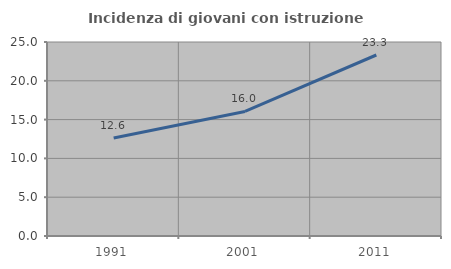
| Category | Incidenza di giovani con istruzione universitaria |
|---|---|
| 1991.0 | 12.634 |
| 2001.0 | 16.046 |
| 2011.0 | 23.325 |